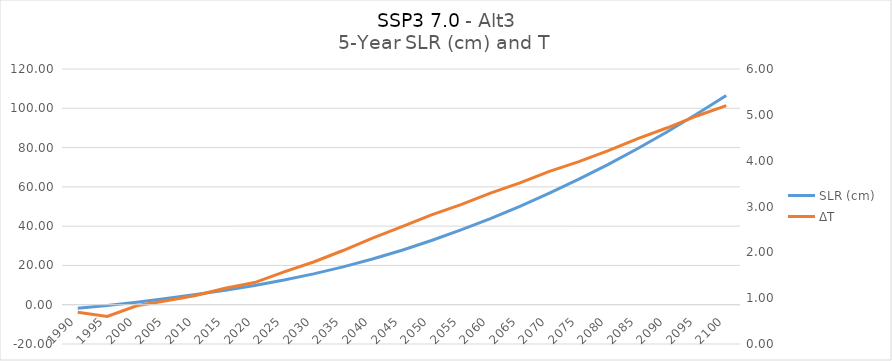
| Category | SLR (cm) |
|---|---|
| 1990.0 | -1.781 |
| 1995.0 | -0.455 |
| 2000.0 | 1.253 |
| 2005.0 | 3.132 |
| 2010.0 | 5.16 |
| 2015.0 | 7.412 |
| 2020.0 | 9.814 |
| 2025.0 | 12.59 |
| 2030.0 | 15.709 |
| 2035.0 | 19.254 |
| 2040.0 | 23.278 |
| 2045.0 | 27.752 |
| 2050.0 | 32.706 |
| 2055.0 | 38.055 |
| 2060.0 | 43.877 |
| 2065.0 | 50.105 |
| 2070.0 | 56.817 |
| 2075.0 | 63.912 |
| 2080.0 | 71.458 |
| 2085.0 | 79.52 |
| 2090.0 | 88.04 |
| 2095.0 | 97.073 |
| 2100.0 | 106.537 |